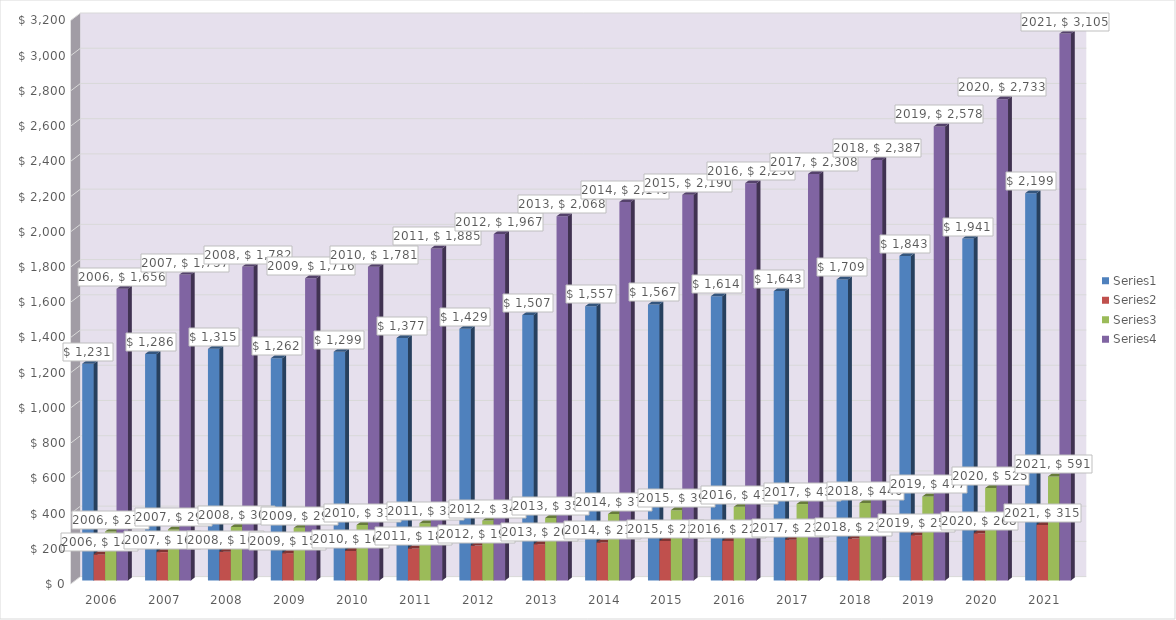
| Category | Series 0 | Series 1 | Series 2 | Series 3 |
|---|---|---|---|---|
| 2006.0 | 1231 | 148 | 278 | 1656 |
| 2007.0 | 1286 | 161 | 290 | 1737 |
| 2008.0 | 1315 | 163 | 304 | 1782 |
| 2009.0 | 1262 | 155 | 299 | 1716 |
| 2010.0 | 1299 | 168 | 315 | 1781 |
| 2011.0 | 1377 | 182 | 325 | 1885 |
| 2012.0 | 1429 | 198 | 340 | 1967 |
| 2013.0 | 1507 | 206 | 355 | 2068 |
| 2014.0 | 1557 | 216 | 377 | 2149 |
| 2015.0 | 1567 | 224 | 399 | 2190 |
| 2016.0 | 1614 | 224 | 418 | 2256 |
| 2017.0 | 1643 | 231 | 434 | 2308 |
| 2018.0 | 1709 | 238 | 440 | 2387 |
| 2019.0 | 1843 | 257 | 477 | 2578 |
| 2020.0 | 1941 | 268 | 525 | 2733 |
| 2021.0 | 2199 | 315 | 591 | 3105 |